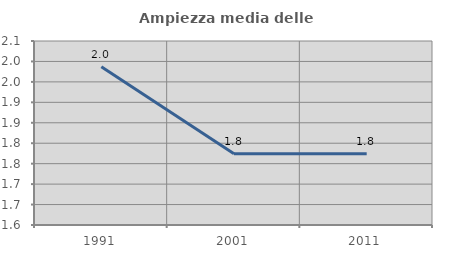
| Category | Ampiezza media delle famiglie |
|---|---|
| 1991.0 | 1.987 |
| 2001.0 | 1.774 |
| 2011.0 | 1.774 |